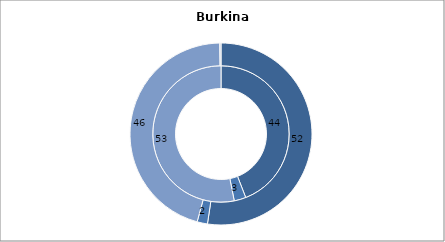
| Category | Immigrants | Native population |
|---|---|---|
| Employed | 44.09 | 52.39 |
| Unemployed | 2.8 | 1.84 |
| Non-active | 53.11 | 45.57 |
| Other | 0 | 0.21 |